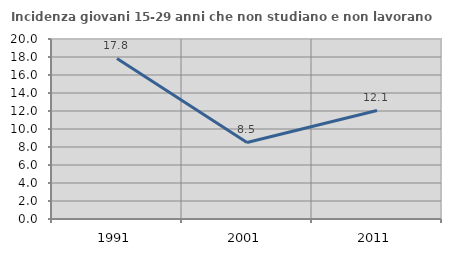
| Category | Incidenza giovani 15-29 anni che non studiano e non lavorano  |
|---|---|
| 1991.0 | 17.845 |
| 2001.0 | 8.504 |
| 2011.0 | 12.059 |